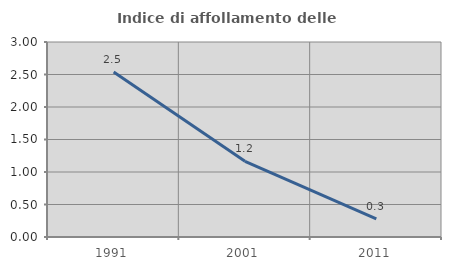
| Category | Indice di affollamento delle abitazioni  |
|---|---|
| 1991.0 | 2.537 |
| 2001.0 | 1.165 |
| 2011.0 | 0.279 |